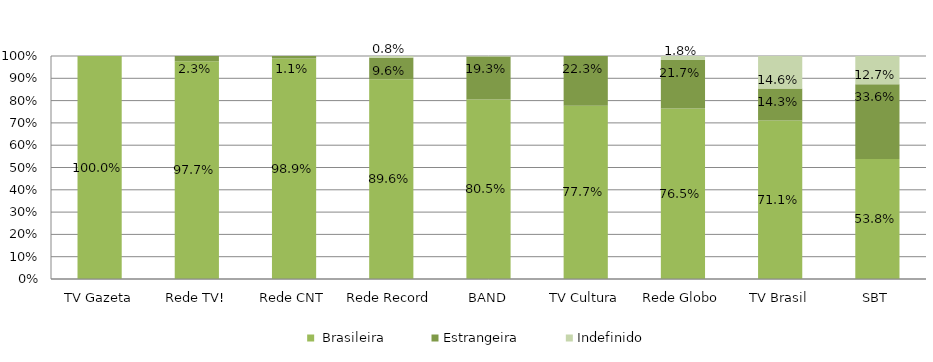
| Category |  Brasileira | Estrangeira | Indefinido |
|---|---|---|---|
| TV Gazeta | 1 | 0 | 0 |
| Rede TV! | 0.977 | 0.023 | 0 |
| Rede CNT | 0.989 | 0.011 | 0 |
| Rede Record | 0.896 | 0.096 | 0.008 |
| BAND | 0.805 | 0.193 | 0.002 |
| TV Cultura | 0.777 | 0.223 | 0 |
| Rede Globo | 0.765 | 0.217 | 0.018 |
| TV Brasil | 0.711 | 0.143 | 0.146 |
| SBT | 0.538 | 0.336 | 0.127 |